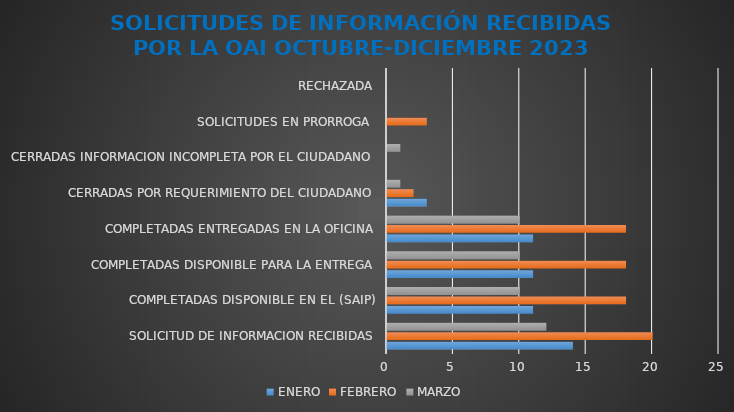
| Category | ENERO | FEBRERO | MARZO |
|---|---|---|---|
| SOLICITUD DE INFORMACION RECIBIDAS | 14 | 20 | 12 |
| COMPLETADAS DISPONIBLE EN EL (SAIP) | 11 | 18 | 10 |
| COMPLETADAS DISPONIBLE PARA LA ENTREGA | 11 | 18 | 10 |
| COMPLETADAS ENTREGADAS EN LA OFICINA | 11 | 18 | 10 |
| CERRADAS POR REQUERIMIENTO DEL CIUDADANO | 3 | 2 | 1 |
| CERRADAS INFORMACION INCOMPLETA POR EL CIUDADANO | 0 | 0 | 1 |
| SOLICITUDES EN PRORROGA  | 0 | 3 | 0 |
| RECHAZADA | 0 | 0 | 0 |